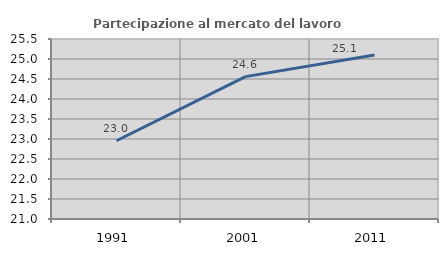
| Category | Partecipazione al mercato del lavoro  femminile |
|---|---|
| 1991.0 | 22.956 |
| 2001.0 | 24.559 |
| 2011.0 | 25.098 |